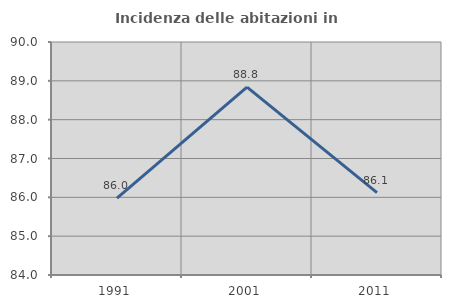
| Category | Incidenza delle abitazioni in proprietà  |
|---|---|
| 1991.0 | 85.977 |
| 2001.0 | 88.836 |
| 2011.0 | 86.122 |